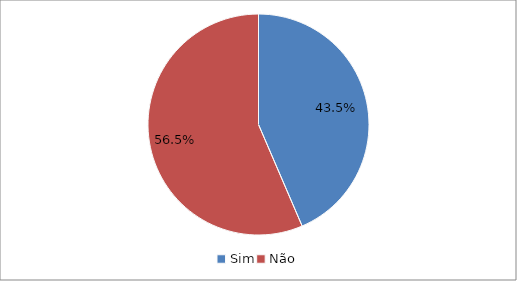
| Category | Series 0 |
|---|---|
| Sim | 0.435 |
| Não | 0.565 |